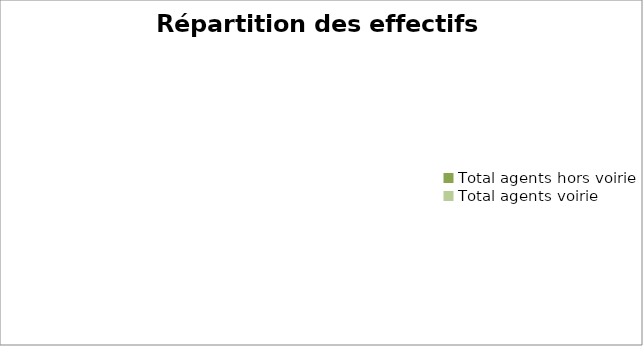
| Category | Total agents hors voirie |
|---|---|
| Total agents hors voirie | 0 |
| Total agents voirie | 0 |